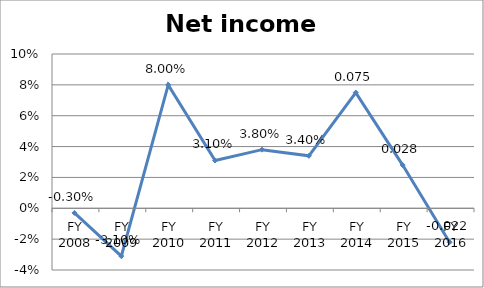
| Category | Net income ratio |
|---|---|
| FY 2016 | -0.022 |
| FY 2015 | 0.028 |
| FY 2014 | 0.075 |
| FY 2013 | 0.034 |
| FY 2012 | 0.038 |
| FY 2011 | 0.031 |
| FY 2010 | 0.08 |
| FY 2009 | -0.031 |
| FY 2008 | -0.003 |